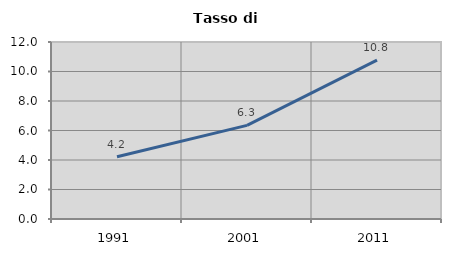
| Category | Tasso di disoccupazione   |
|---|---|
| 1991.0 | 4.225 |
| 2001.0 | 6.349 |
| 2011.0 | 10.769 |